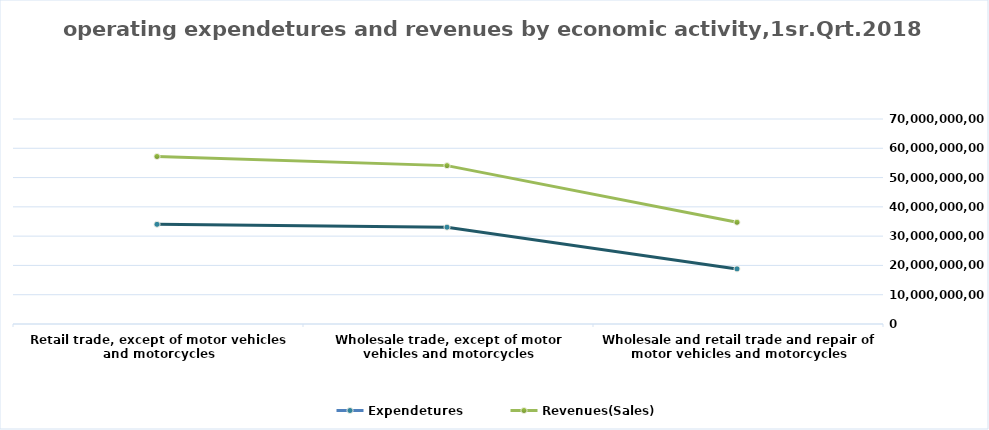
| Category | Expendetures | Revenues(Sales) |
|---|---|---|
| Wholesale and retail trade and repair of motor vehicles and motorcycles | 18816710013 | 34742972960 |
| Wholesale trade, except of motor vehicles and motorcycles | 33062516737 | 54080825540 |
| Retail trade, except of motor vehicles and motorcycles | 34035938340 | 57201609402 |